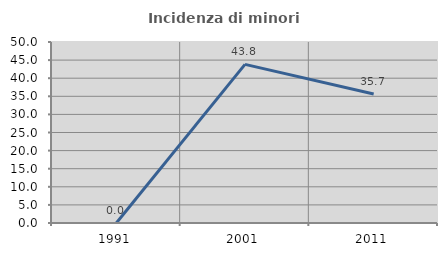
| Category | Incidenza di minori stranieri |
|---|---|
| 1991.0 | 0 |
| 2001.0 | 43.82 |
| 2011.0 | 35.652 |